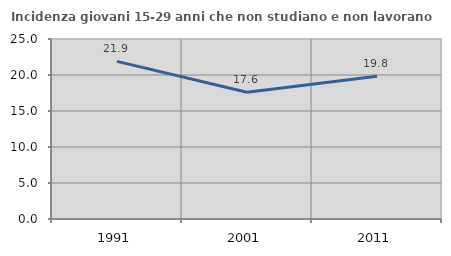
| Category | Incidenza giovani 15-29 anni che non studiano e non lavorano  |
|---|---|
| 1991.0 | 21.895 |
| 2001.0 | 17.606 |
| 2011.0 | 19.818 |